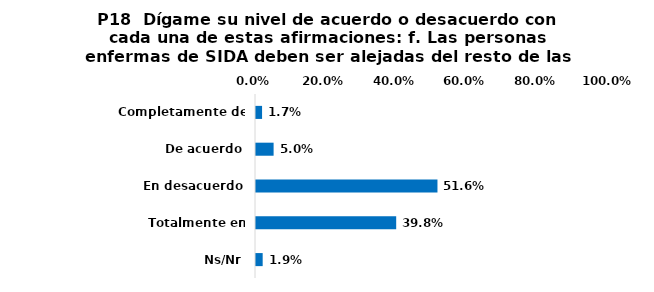
| Category | Series 0 |
|---|---|
| Completamente de acuerdo | 0.017 |
| De acuerdo | 0.05 |
| En desacuerdo | 0.516 |
| Totalmente en desacuerdo | 0.398 |
| Ns/Nr | 0.019 |